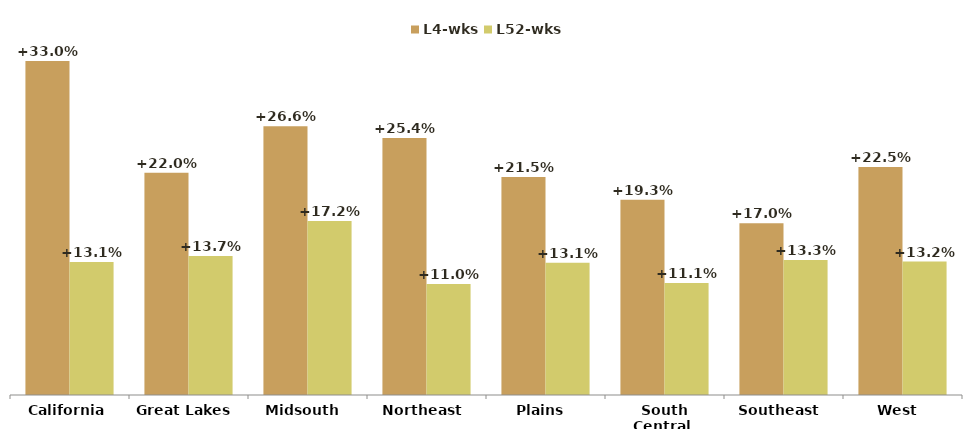
| Category | L4-wks | L52-wks |
|---|---|---|
| California | 0.33 | 0.131 |
| Great Lakes  | 0.22 | 0.137 |
| Midsouth  | 0.266 | 0.172 |
| Northeast  | 0.254 | 0.11 |
| Plains  | 0.215 | 0.131 |
| South Central  | 0.193 | 0.111 |
| Southeast  | 0.17 | 0.133 |
| West  | 0.225 | 0.132 |